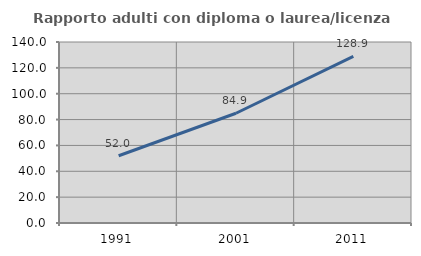
| Category | Rapporto adulti con diploma o laurea/licenza media  |
|---|---|
| 1991.0 | 52.027 |
| 2001.0 | 84.896 |
| 2011.0 | 128.866 |